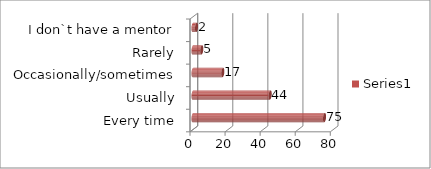
| Category | Series 0 |
|---|---|
| Every time | 75 |
| Usually | 44 |
| Occasionally/sometimes | 17 |
| Rarely | 5 |
| I don`t have a mentor | 2 |